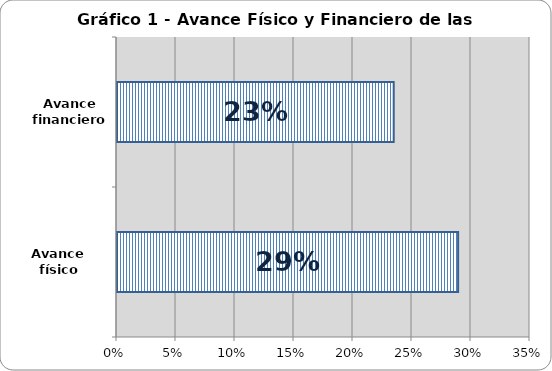
| Category | Series 0 |
|---|---|
| Avance físico | 0.289 |
| Avance financiero | 0.234 |